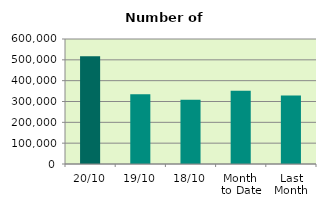
| Category | Series 0 |
|---|---|
| 20/10 | 517152 |
| 19/10 | 334730 |
| 18/10 | 308860 |
| Month 
to Date | 351337 |
| Last
Month | 328669.364 |